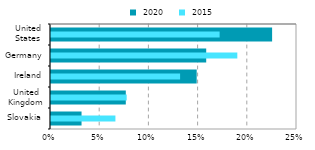
| Category |  2020 |
|---|---|
| Slovakia | 0.031 |
| United
Kingdom | 0.076 |
| Ireland | 0.148 |
| Germany | 0.158 |
| United
States | 0.225 |